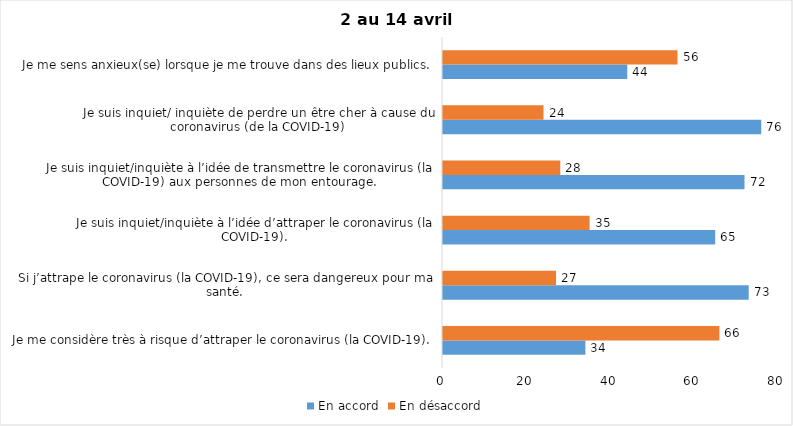
| Category | En accord | En désaccord |
|---|---|---|
| Je me considère très à risque d’attraper le coronavirus (la COVID-19). | 34 | 66 |
| Si j’attrape le coronavirus (la COVID-19), ce sera dangereux pour ma santé. | 73 | 27 |
| Je suis inquiet/inquiète à l’idée d’attraper le coronavirus (la COVID-19). | 65 | 35 |
| Je suis inquiet/inquiète à l’idée de transmettre le coronavirus (la COVID-19) aux personnes de mon entourage. | 72 | 28 |
| Je suis inquiet/ inquiète de perdre un être cher à cause du coronavirus (de la COVID-19) | 76 | 24 |
| Je me sens anxieux(se) lorsque je me trouve dans des lieux publics. | 44 | 56 |